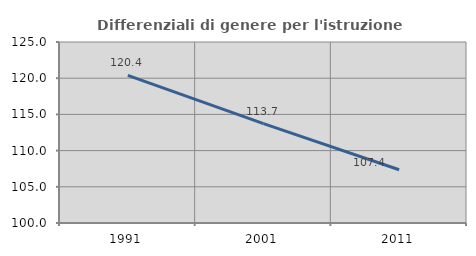
| Category | Differenziali di genere per l'istruzione superiore |
|---|---|
| 1991.0 | 120.39 |
| 2001.0 | 113.722 |
| 2011.0 | 107.36 |